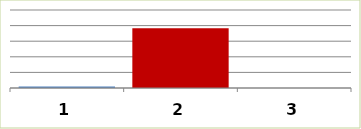
| Category | Series 0 |
|---|---|
| 0 | 50000 |
| 1 | 1916140 |
| 2 | 0 |